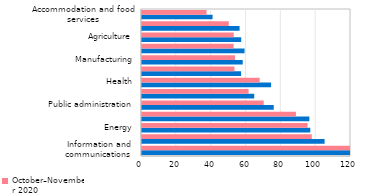
| Category | October–November 2021 | October–November 2020 |
|---|---|---|
| Information and communications  | 161.518 | 122.317 |
| Financial sector | 104.835 | 97.474 |
| Energy | 96.624 | 95.064 |
| Mining | 96.092 | 88.378 |
| Public administration | 75.64 | 69.878 |
| Education | 64.439 | 61.182 |
| Health | 74.124 | 67.55 |
| Transport and storage  | 56.892 | 53.107 |
| Manufacturing | 57.842 | 53.398 |
| Construction | 58.879 | 52.608 |
| Agriculture | 56.95 | 52.672 |
| Trade | 56.022 | 49.825 |
| Accommodation and food services | 40.519 | 37.054 |